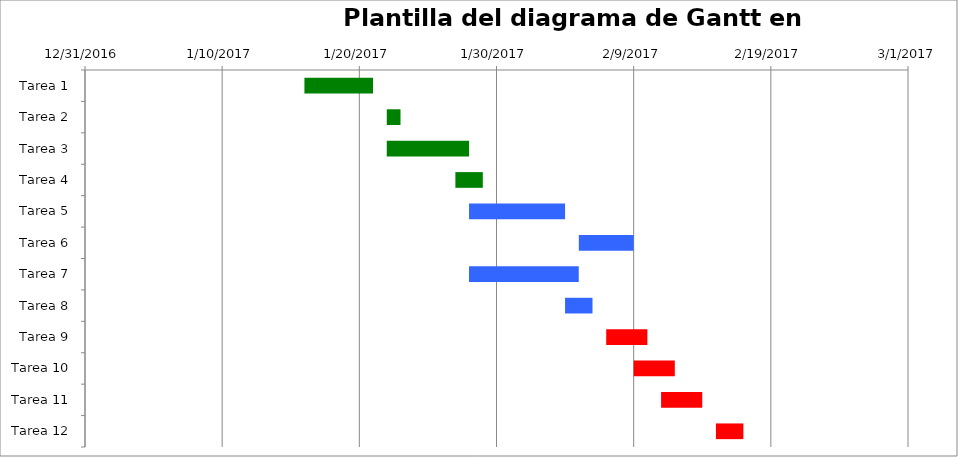
| Category | Fecha de inicio | Duración (días) |
|---|---|---|
| Tarea 1 | 1/16/17 | 5 |
| Tarea 2 | 1/22/17 | 1 |
| Tarea 3 | 1/22/17 | 6 |
| Tarea 4 | 1/27/17 | 2 |
| Tarea 5 | 1/28/17 | 7 |
| Tarea 6 | 2/5/17 | 4 |
| Tarea 7 | 1/28/17 | 8 |
| Tarea 8 | 2/4/17 | 2 |
| Tarea 9 | 2/7/17 | 3 |
| Tarea 10 | 2/9/17 | 3 |
| Tarea 11 | 2/11/17 | 3 |
| Tarea 12 | 2/15/17 | 2 |